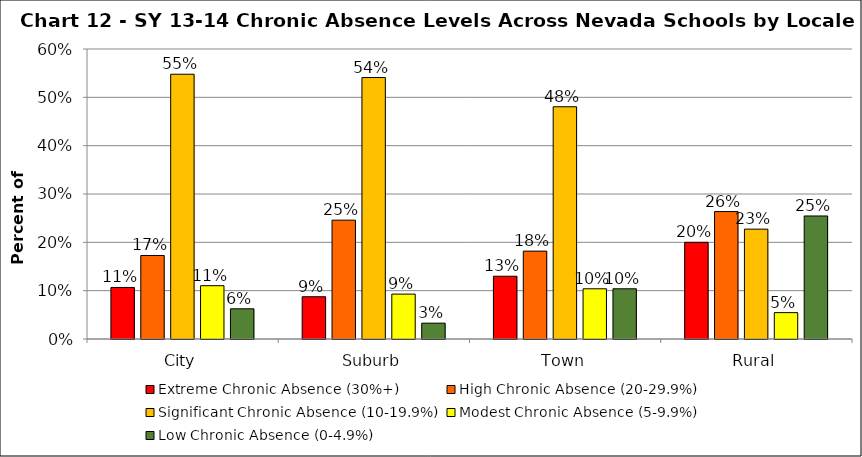
| Category | Extreme Chronic Absence (30%+) | High Chronic Absence (20-29.9%) | Significant Chronic Absence (10-19.9%) | Modest Chronic Absence (5-9.9%) | Low Chronic Absence (0-4.9%) |
|---|---|---|---|---|---|
| 0 | 0.107 | 0.173 | 0.548 | 0.11 | 0.062 |
| 1 | 0.087 | 0.246 | 0.541 | 0.093 | 0.033 |
| 2 | 0.13 | 0.182 | 0.481 | 0.104 | 0.104 |
| 3 | 0.2 | 0.264 | 0.227 | 0.055 | 0.255 |